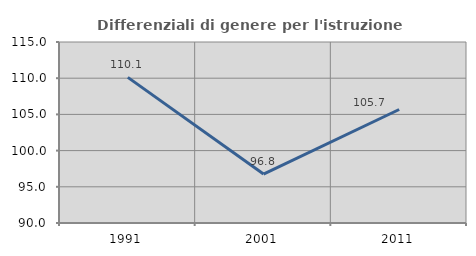
| Category | Differenziali di genere per l'istruzione superiore |
|---|---|
| 1991.0 | 110.112 |
| 2001.0 | 96.76 |
| 2011.0 | 105.676 |